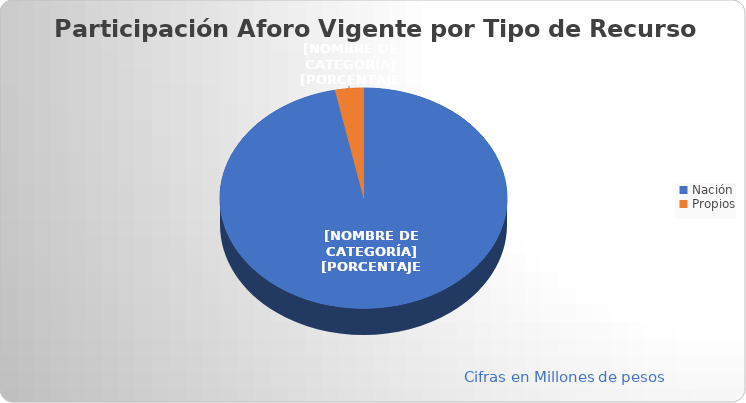
| Category | Total |
|---|---|
| Nación | 5588001.521 |
| Propios | 184570.824 |